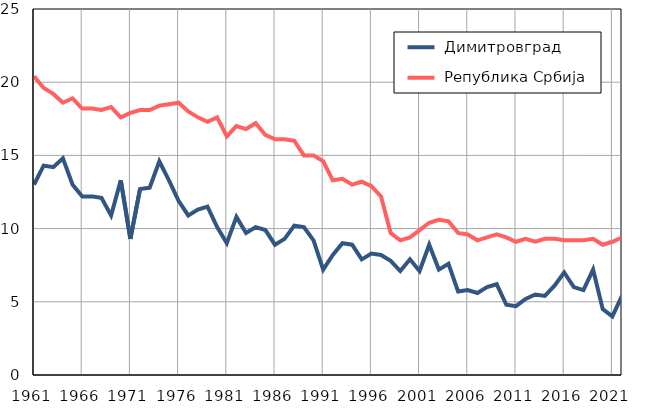
| Category |  Димитровград |  Република Србија |
|---|---|---|
| 1961.0 | 13 | 20.4 |
| 1962.0 | 14.3 | 19.6 |
| 1963.0 | 14.2 | 19.2 |
| 1964.0 | 14.8 | 18.6 |
| 1965.0 | 13 | 18.9 |
| 1966.0 | 12.2 | 18.2 |
| 1967.0 | 12.2 | 18.2 |
| 1968.0 | 12.1 | 18.1 |
| 1969.0 | 10.9 | 18.3 |
| 1970.0 | 13.3 | 17.6 |
| 1971.0 | 9.3 | 17.9 |
| 1972.0 | 12.7 | 18.1 |
| 1973.0 | 12.8 | 18.1 |
| 1974.0 | 14.6 | 18.4 |
| 1975.0 | 13.3 | 18.5 |
| 1976.0 | 11.9 | 18.6 |
| 1977.0 | 10.9 | 18 |
| 1978.0 | 11.3 | 17.6 |
| 1979.0 | 11.5 | 17.3 |
| 1980.0 | 10.1 | 17.6 |
| 1981.0 | 9 | 16.3 |
| 1982.0 | 10.8 | 17 |
| 1983.0 | 9.7 | 16.8 |
| 1984.0 | 10.1 | 17.2 |
| 1985.0 | 9.9 | 16.4 |
| 1986.0 | 8.9 | 16.1 |
| 1987.0 | 9.3 | 16.1 |
| 1988.0 | 10.2 | 16 |
| 1989.0 | 10.1 | 15 |
| 1990.0 | 9.2 | 15 |
| 1991.0 | 7.2 | 14.6 |
| 1992.0 | 8.2 | 13.3 |
| 1993.0 | 9 | 13.4 |
| 1994.0 | 8.9 | 13 |
| 1995.0 | 7.9 | 13.2 |
| 1996.0 | 8.3 | 12.9 |
| 1997.0 | 8.2 | 12.2 |
| 1998.0 | 7.8 | 9.7 |
| 1999.0 | 7.1 | 9.2 |
| 2000.0 | 7.9 | 9.4 |
| 2001.0 | 7.1 | 9.9 |
| 2002.0 | 8.9 | 10.4 |
| 2003.0 | 7.2 | 10.6 |
| 2004.0 | 7.6 | 10.5 |
| 2005.0 | 5.7 | 9.7 |
| 2006.0 | 5.8 | 9.6 |
| 2007.0 | 5.6 | 9.2 |
| 2008.0 | 6 | 9.4 |
| 2009.0 | 6.2 | 9.6 |
| 2010.0 | 4.8 | 9.4 |
| 2011.0 | 4.7 | 9.1 |
| 2012.0 | 5.2 | 9.3 |
| 2013.0 | 5.5 | 9.1 |
| 2014.0 | 5.4 | 9.3 |
| 2015.0 | 6.1 | 9.3 |
| 2016.0 | 7 | 9.2 |
| 2017.0 | 6 | 9.2 |
| 2018.0 | 5.8 | 9.2 |
| 2019.0 | 7.2 | 9.3 |
| 2020.0 | 4.5 | 8.9 |
| 2021.0 | 4 | 9.1 |
| 2022.0 | 5.4 | 9.4 |